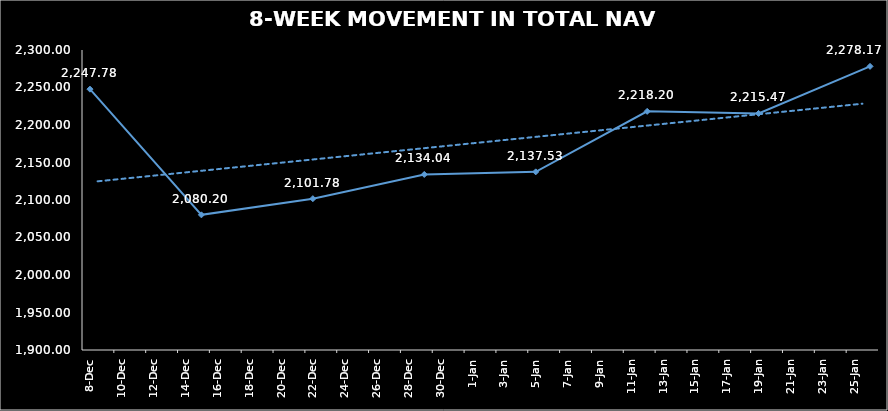
| Category | TOTAL NAV |
|---|---|
| 2023-12-08 | 2247.78 |
| 2023-12-15 | 2080.204 |
| 2023-12-22 | 2101.782 |
| 2023-12-29 | 2134.045 |
| 2024-01-05 | 2137.525 |
| 2024-01-12 | 2218.205 |
| 2024-01-19 | 2215.471 |
| 2024-01-26 | 2278.172 |